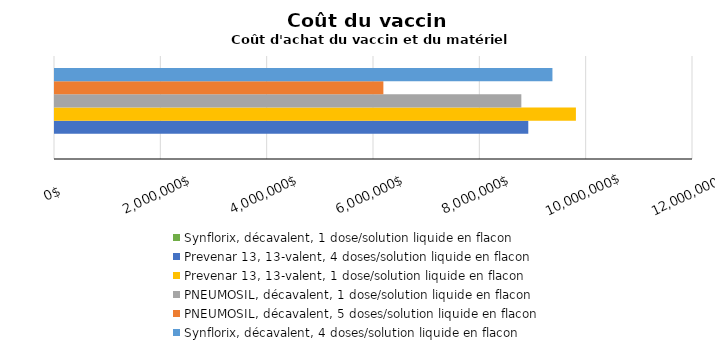
| Category | Synflorix, décavalent, 1 dose/solution liquide en flacon | Prevenar 13, 13-valent, 4 doses/solution liquide en flacon | Prevenar 13, 13-valent, 1 dose/solution liquide en flacon | PNEUMOSIL, décavalent, 1 dose/solution liquide en flacon | PNEUMOSIL, décavalent, 5 doses/solution liquide en flacon | Synflorix, décavalent, 4 doses/solution liquide en flacon |
|---|---|---|---|---|---|---|
| Total
pour 10 ans | 0 | 8901935.55 | 9797721.506 | 8771233.685 | 6176323.48 | 9356204.229 |